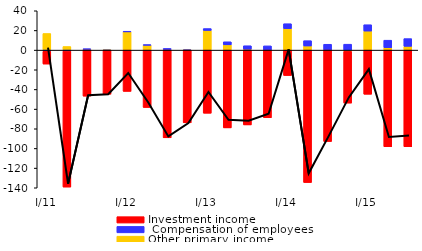
| Category | Other primary income |  Compensation of employees | Investment income |
|---|---|---|---|
| I/11 | 16.905 | -1.179 | -13.01 |
| II | 3.673 | -0.898 | -138.45 |
| III | 0.917 | 0.182 | -46.828 |
| IV | 0.201 | -0.359 | -44.5 |
| I/12 | 18.684 | 0.227 | -41.994 |
| II | 5.046 | 0.336 | -58.363 |
| III | 0.625 | 1.034 | -89.224 |
| IV | 0.042 | -0.116 | -73.825 |
| I/13 | 19.989 | 1.936 | -64.207 |
| II | 5.367 | 3.108 | -79.099 |
| III | 0.9 | 3.539 | -76.077 |
| IV | -0.021 | 4.321 | -68.775 |
| I/14 | 21.825 | 5.021 | -25.838 |
| II | 4.194 | 5.405 | -134.69 |
| III | 0.166 | 5.79 | -92.96 |
| IV | -1.284 | 6.025 | -52.617 |
| I/15 | 19.364 | 6.452 | -44.908 |
| II | 2.466 | 7.619 | -98.264 |
| III | 3.856 | 7.858 | -98.284 |